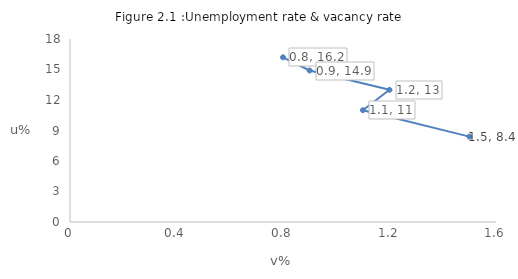
| Category | Unemployment rate (Eurostat) |
|---|---|
| 0.8 | 16.2 |
| 0.9 | 14.9 |
| 1.2 | 13 |
| 1.1 | 11 |
| 1.5 | 8.4 |